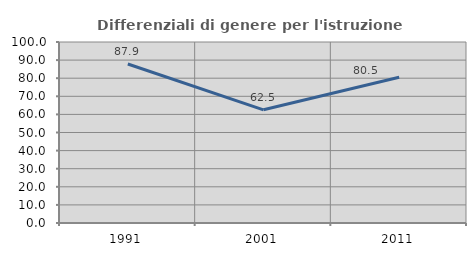
| Category | Differenziali di genere per l'istruzione superiore |
|---|---|
| 1991.0 | 87.869 |
| 2001.0 | 62.541 |
| 2011.0 | 80.503 |